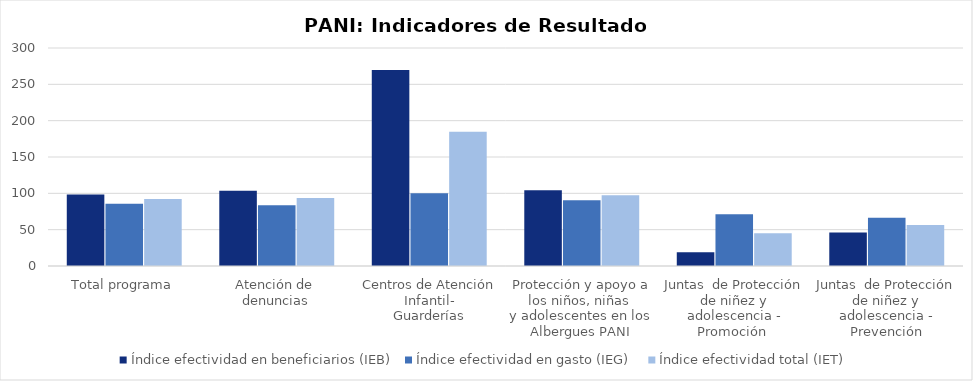
| Category | Índice efectividad en beneficiarios (IEB) | Índice efectividad en gasto (IEG)  | Índice efectividad total (IET) |
|---|---|---|---|
| Total programa | 98.426 | 85.705 | 92.066 |
| Atención de 
denuncias | 103.614 | 83.444 | 93.529 |
| Centros de Atención Infantil-
Guarderías | 269.83 | 99.996 | 184.913 |
| Protección y apoyo a los niños, niñas 
y adolescentes en los Albergues PANI | 104.076 | 90.554 | 97.315 |
| Juntas  de Protección de niñez y adolescencia - Promoción  | 18.878 | 71.387 | 45.133 |
| Juntas  de Protección de niñez y adolescencia - Prevención | 46.257 | 66.326 | 56.292 |